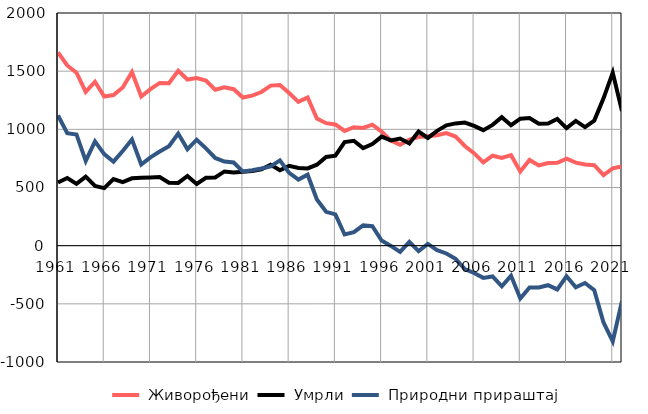
| Category |  Живорођени |  Умрли |  Природни прираштај |
|---|---|---|---|
| 1961.0 | 1662 | 543 | 1119 |
| 1962.0 | 1549 | 582 | 967 |
| 1963.0 | 1487 | 531 | 956 |
| 1964.0 | 1322 | 594 | 728 |
| 1965.0 | 1409 | 513 | 896 |
| 1966.0 | 1282 | 495 | 787 |
| 1967.0 | 1295 | 573 | 722 |
| 1968.0 | 1360 | 546 | 814 |
| 1969.0 | 1492 | 579 | 913 |
| 1970.0 | 1282 | 584 | 698 |
| 1971.0 | 1346 | 587 | 759 |
| 1972.0 | 1399 | 590 | 809 |
| 1973.0 | 1396 | 541 | 855 |
| 1974.0 | 1503 | 539 | 964 |
| 1975.0 | 1428 | 599 | 829 |
| 1976.0 | 1441 | 530 | 911 |
| 1977.0 | 1420 | 584 | 836 |
| 1978.0 | 1340 | 586 | 754 |
| 1979.0 | 1361 | 638 | 723 |
| 1980.0 | 1345 | 630 | 715 |
| 1981.0 | 1273 | 636 | 637 |
| 1982.0 | 1290 | 641 | 649 |
| 1983.0 | 1321 | 657 | 664 |
| 1984.0 | 1376 | 695 | 681 |
| 1985.0 | 1381 | 648 | 733 |
| 1986.0 | 1312 | 686 | 626 |
| 1987.0 | 1236 | 668 | 568 |
| 1988.0 | 1274 | 664 | 610 |
| 1989.0 | 1093 | 696 | 397 |
| 1990.0 | 1053 | 762 | 291 |
| 1991.0 | 1042 | 773 | 269 |
| 1992.0 | 986 | 890 | 96 |
| 1993.0 | 1018 | 902 | 116 |
| 1994.0 | 1012 | 838 | 174 |
| 1995.0 | 1040 | 873 | 167 |
| 1996.0 | 981 | 937 | 44 |
| 1997.0 | 903 | 905 | -2 |
| 1998.0 | 868 | 921 | -53 |
| 1999.0 | 911 | 878 | 33 |
| 2000.0 | 934 | 981 | -47 |
| 2001.0 | 941 | 926 | 15 |
| 2002.0 | 949 | 987 | -38 |
| 2003.0 | 967 | 1034 | -67 |
| 2004.0 | 938 | 1051 | -113 |
| 2005.0 | 857 | 1058 | -201 |
| 2006.0 | 795 | 1030 | -235 |
| 2007.0 | 716 | 993 | -277 |
| 2008.0 | 773 | 1038 | -265 |
| 2009.0 | 754 | 1104 | -350 |
| 2010.0 | 778 | 1036 | -258 |
| 2011.0 | 638 | 1092 | -454 |
| 2012.0 | 737 | 1097 | -360 |
| 2013.0 | 690 | 1049 | -359 |
| 2014.0 | 710 | 1050 | -340 |
| 2015.0 | 713 | 1089 | -376 |
| 2016.0 | 748 | 1011 | -263 |
| 2017.0 | 714 | 1072 | -358 |
| 2018.0 | 698 | 1019 | -321 |
| 2019.0 | 692 | 1075 | -383 |
| 2020.0 | 606 | 1266 | -660 |
| 2021.0 | 665 | 1487 | -822 |
| 2022.0 | 681 | 1157 | -476 |